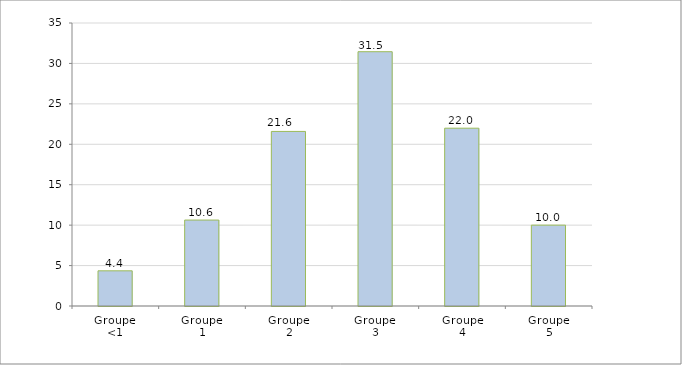
| Category | 2022 |
|---|---|
| Groupe 
<1 | 4.35 |
| Groupe 
1 | 10.63 |
| Groupe 
2 | 21.59 |
| Groupe 
3 | 31.45 |
| Groupe
4 | 21.99 |
| Groupe 
5 | 10 |